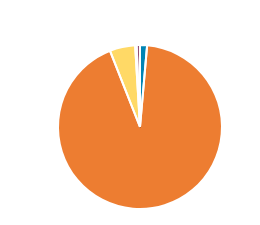
| Category | Series 0 |
|---|---|
| PC/MC | 1743 |
| CAR/LGV | 116660 |
| OGV1 & PSV 2Axle | 6326 |
| OGV1 & PSV 3 Axle | 362 |
| OGV2 | 830 |